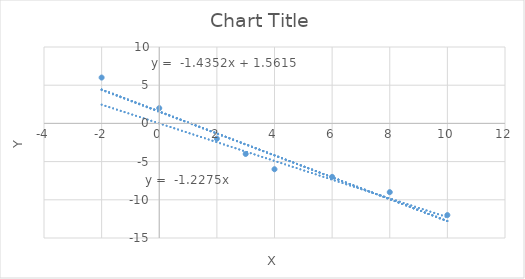
| Category | Series 0 |
|---|---|
| -2.0 | 6 |
| 0.0 | 2 |
| 2.0 | -2 |
| 3.0 | -4 |
| 4.0 | -6 |
| 6.0 | -7 |
| 8.0 | -9 |
| 10.0 | -12 |